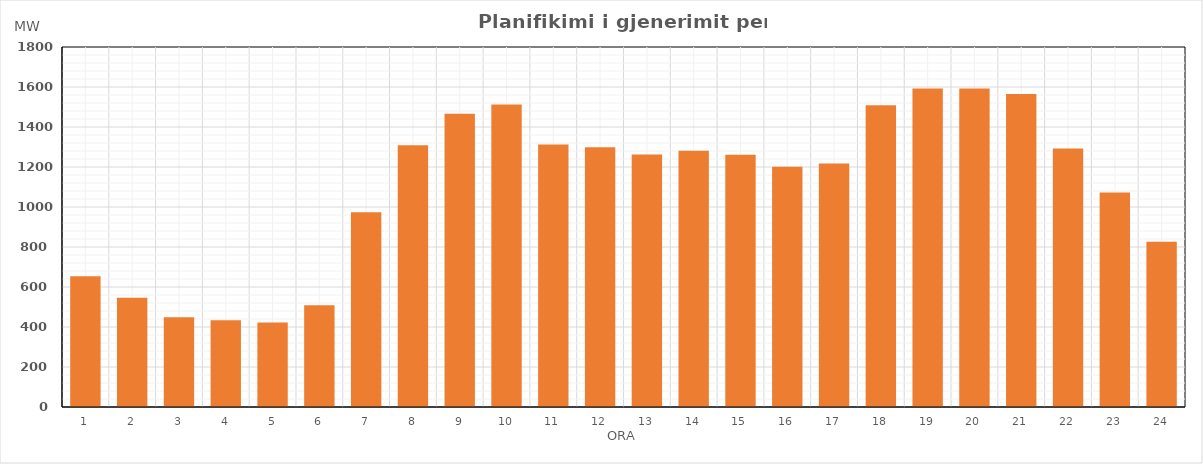
| Category | Max (MW) |
|---|---|
| 0 | 653.579 |
| 1 | 546.22 |
| 2 | 449.22 |
| 3 | 434.166 |
| 4 | 422.22 |
| 5 | 508.71 |
| 6 | 974.122 |
| 7 | 1309.22 |
| 8 | 1465.817 |
| 9 | 1512.144 |
| 10 | 1313.108 |
| 11 | 1299.056 |
| 12 | 1262.02 |
| 13 | 1281.128 |
| 14 | 1260.99 |
| 15 | 1201.66 |
| 16 | 1217.714 |
| 17 | 1509.178 |
| 18 | 1592.78 |
| 19 | 1592.794 |
| 20 | 1564.687 |
| 21 | 1292.987 |
| 22 | 1071.913 |
| 23 | 826.573 |